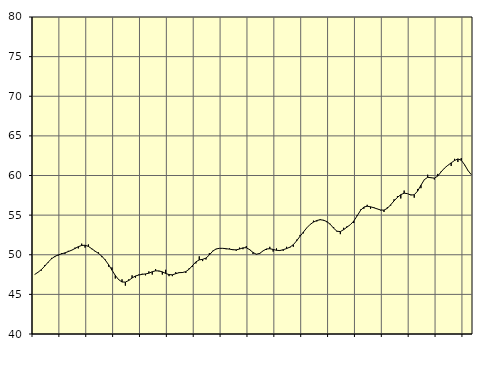
| Category | Piggar | Samtliga anställda (inkl. anställda utomlands) |
|---|---|---|
| nan | 47.5 | 47.51 |
| 87.0 | 47.8 | 47.79 |
| 87.0 | 48 | 48.13 |
| 87.0 | 48.7 | 48.57 |
| nan | 49 | 49.06 |
| 88.0 | 49.6 | 49.48 |
| 88.0 | 49.7 | 49.79 |
| 88.0 | 49.9 | 49.98 |
| nan | 50.2 | 50.11 |
| 89.0 | 50.1 | 50.24 |
| 89.0 | 50.5 | 50.4 |
| 89.0 | 50.6 | 50.57 |
| nan | 50.9 | 50.79 |
| 90.0 | 50.8 | 51.02 |
| 90.0 | 51.4 | 51.17 |
| 90.0 | 50.9 | 51.2 |
| nan | 51.3 | 51.05 |
| 91.0 | 50.7 | 50.76 |
| 91.0 | 50.4 | 50.45 |
| 91.0 | 50.3 | 50.17 |
| nan | 49.7 | 49.82 |
| 92.0 | 49.4 | 49.34 |
| 92.0 | 48.5 | 48.75 |
| 92.0 | 48.4 | 48.06 |
| nan | 47 | 47.39 |
| 93.0 | 46.9 | 46.86 |
| 93.0 | 46.9 | 46.56 |
| 93.0 | 46.1 | 46.55 |
| nan | 46.9 | 46.75 |
| 94.0 | 47.4 | 47.07 |
| 94.0 | 47.1 | 47.32 |
| 94.0 | 47.5 | 47.44 |
| nan | 47.6 | 47.53 |
| 95.0 | 47.4 | 47.58 |
| 95.0 | 47.9 | 47.67 |
| 95.0 | 47.5 | 47.86 |
| nan | 48.2 | 47.97 |
| 96.0 | 47.9 | 47.96 |
| 96.0 | 47.5 | 47.84 |
| 96.0 | 48.1 | 47.64 |
| nan | 47.3 | 47.5 |
| 97.0 | 47.3 | 47.47 |
| 97.0 | 47.8 | 47.61 |
| 97.0 | 47.8 | 47.74 |
| nan | 47.7 | 47.76 |
| 98.0 | 47.7 | 47.87 |
| 98.0 | 48.3 | 48.18 |
| 98.0 | 48.5 | 48.64 |
| nan | 48.9 | 49.1 |
| 99.0 | 49.8 | 49.35 |
| 99.0 | 49.2 | 49.42 |
| 99.0 | 49.4 | 49.58 |
| nan | 50.2 | 49.97 |
| 0.0 | 50.5 | 50.45 |
| 0.0 | 50.7 | 50.73 |
| 0.0 | 50.8 | 50.81 |
| nan | 50.8 | 50.81 |
| 1.0 | 50.7 | 50.76 |
| 1.0 | 50.8 | 50.71 |
| 1.0 | 50.7 | 50.63 |
| nan | 50.5 | 50.62 |
| 2.0 | 50.9 | 50.72 |
| 2.0 | 50.7 | 50.87 |
| 2.0 | 51.1 | 50.89 |
| nan | 50.7 | 50.64 |
| 3.0 | 50.1 | 50.29 |
| 3.0 | 50.1 | 50.06 |
| 3.0 | 50.1 | 50.17 |
| nan | 50.5 | 50.49 |
| 4.0 | 50.6 | 50.73 |
| 4.0 | 51 | 50.76 |
| 4.0 | 50.4 | 50.67 |
| nan | 50.8 | 50.56 |
| 5.0 | 50.6 | 50.53 |
| 5.0 | 50.5 | 50.64 |
| 5.0 | 51 | 50.78 |
| nan | 50.9 | 50.96 |
| 6.0 | 51 | 51.27 |
| 6.0 | 51.9 | 51.76 |
| 6.0 | 52.5 | 52.33 |
| nan | 52.7 | 52.86 |
| 7.0 | 53.4 | 53.39 |
| 7.0 | 53.8 | 53.82 |
| 7.0 | 54.3 | 54.12 |
| nan | 54.2 | 54.32 |
| 8.0 | 54.5 | 54.42 |
| 8.0 | 54.3 | 54.36 |
| 8.0 | 54.1 | 54.18 |
| nan | 53.9 | 53.84 |
| 9.0 | 53.5 | 53.35 |
| 9.0 | 52.9 | 52.97 |
| 9.0 | 52.6 | 52.92 |
| nan | 53.4 | 53.17 |
| 10.0 | 53.6 | 53.49 |
| 10.0 | 53.8 | 53.8 |
| 10.0 | 54 | 54.25 |
| nan | 55 | 54.9 |
| 11.0 | 55.7 | 55.58 |
| 11.0 | 55.8 | 56.02 |
| 11.0 | 56.3 | 56.12 |
| nan | 55.8 | 56.05 |
| 12.0 | 56 | 55.93 |
| 12.0 | 55.8 | 55.78 |
| 12.0 | 55.6 | 55.65 |
| nan | 55.4 | 55.63 |
| 13.0 | 56 | 55.86 |
| 13.0 | 56.2 | 56.31 |
| 13.0 | 57 | 56.8 |
| nan | 57.4 | 57.24 |
| 14.0 | 57.1 | 57.58 |
| 14.0 | 58.1 | 57.77 |
| 14.0 | 57.7 | 57.71 |
| nan | 57.6 | 57.53 |
| 15.0 | 57.2 | 57.57 |
| 15.0 | 58.3 | 58.03 |
| 15.0 | 58.4 | 58.77 |
| nan | 59.5 | 59.47 |
| 16.0 | 60.1 | 59.77 |
| 16.0 | 59.7 | 59.72 |
| 16.0 | 59.5 | 59.67 |
| nan | 60.2 | 59.92 |
| 17.0 | 60.5 | 60.45 |
| 17.0 | 60.9 | 60.93 |
| 17.0 | 61.3 | 61.28 |
| nan | 61.2 | 61.59 |
| 18.0 | 62.1 | 61.89 |
| 18.0 | 61.7 | 62.09 |
| 18.0 | 62.2 | 61.93 |
| nan | 61.3 | 61.36 |
| 19.0 | 60.6 | 60.63 |
| 19.0 | 60.1 | 60.1 |